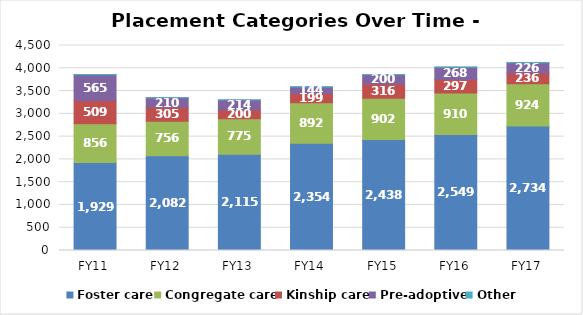
| Category | Foster care | Congregate care | Kinship care | Pre-adoptive | Other |
|---|---|---|---|---|---|
| FY11 | 1929 | 856 | 509 | 565 | 2 |
| FY12 | 2082 | 756 | 305 | 210 | 2 |
| FY13 | 2115 | 775 | 200 | 214 | 2 |
| FY14 | 2354 | 892 | 199 | 144 | 6 |
| FY15 | 2438 | 902 | 316 | 200 | 4 |
| FY16 | 2549 | 910 | 297 | 268 | 6 |
| FY17 | 2734 | 924 | 236 | 226 | 6 |